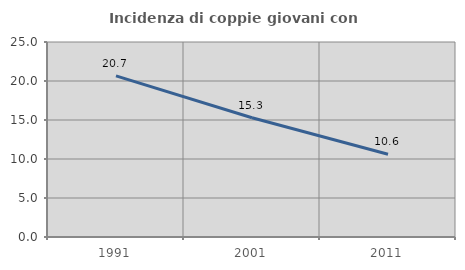
| Category | Incidenza di coppie giovani con figli |
|---|---|
| 1991.0 | 20.662 |
| 2001.0 | 15.287 |
| 2011.0 | 10.602 |